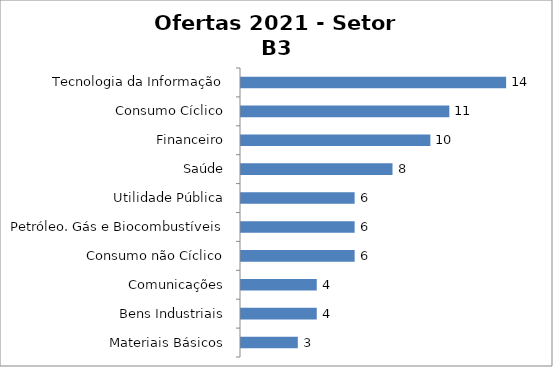
| Category | Setor B3 |
|---|---|
| Tecnologia da Informação | 14 |
| Consumo Cíclico | 11 |
| Financeiro | 10 |
| Saúde | 8 |
| Utilidade Pública | 6 |
| Petróleo. Gás e Biocombustíveis | 6 |
| Consumo não Cíclico | 6 |
| Comunicações | 4 |
| Bens Industriais | 4 |
| Materiais Básicos | 3 |